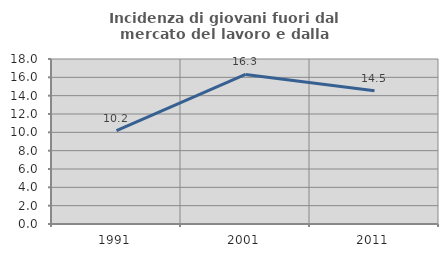
| Category | Incidenza di giovani fuori dal mercato del lavoro e dalla formazione  |
|---|---|
| 1991.0 | 10.192 |
| 2001.0 | 16.32 |
| 2011.0 | 14.541 |